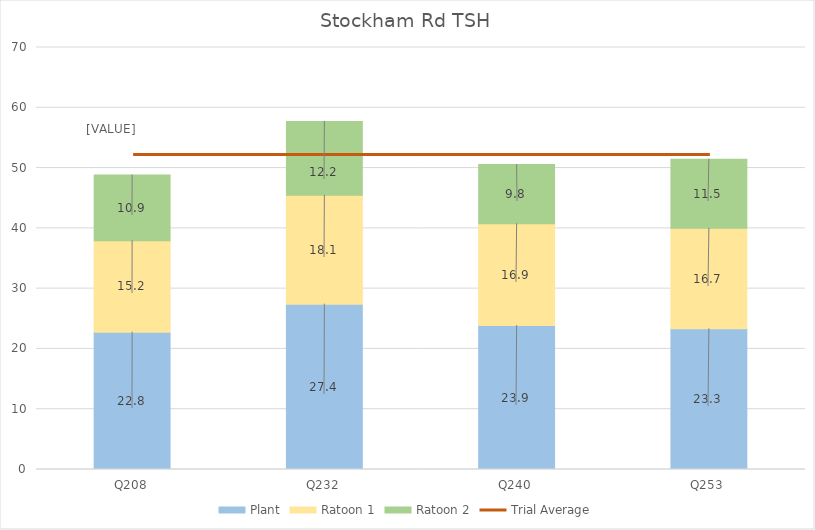
| Category | Plant | Ratoon 1 | Ratoon 2 |
|---|---|---|---|
| Q208 | 22.765 | 15.195 | 10.892 |
| Q232 | 27.431 | 18.051 | 12.237 |
| Q240 | 23.879 | 16.876 | 9.834 |
| Q253 | 23.331 | 16.667 | 11.463 |